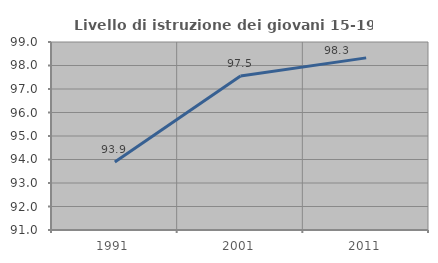
| Category | Livello di istruzione dei giovani 15-19 anni |
|---|---|
| 1991.0 | 93.893 |
| 2001.0 | 97.549 |
| 2011.0 | 98.324 |